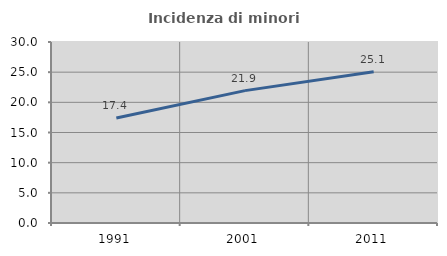
| Category | Incidenza di minori stranieri |
|---|---|
| 1991.0 | 17.391 |
| 2001.0 | 21.941 |
| 2011.0 | 25.068 |